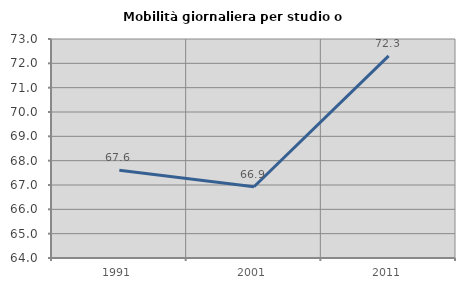
| Category | Mobilità giornaliera per studio o lavoro |
|---|---|
| 1991.0 | 67.611 |
| 2001.0 | 66.927 |
| 2011.0 | 72.307 |